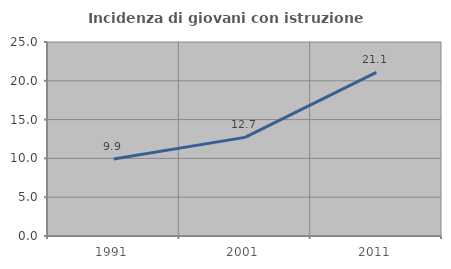
| Category | Incidenza di giovani con istruzione universitaria |
|---|---|
| 1991.0 | 9.917 |
| 2001.0 | 12.712 |
| 2011.0 | 21.074 |